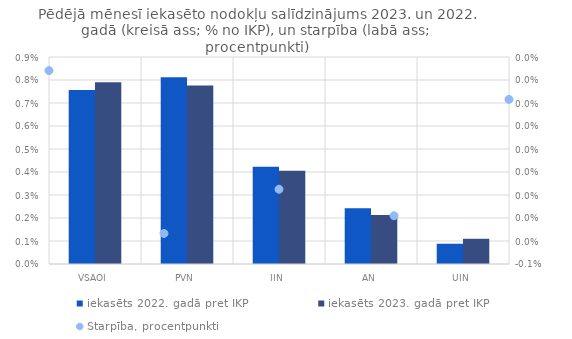
| Category | iekasēts 2022. gadā pret IKP | iekasēts 2023. gadā pret IKP |
|---|---|---|
| VSAOI | 0.008 | 0.008 |
| PVN | 0.008 | 0.008 |
| IIN | 0.004 | 0.004 |
| AN | 0.002 | 0.002 |
| UIN | 0.001 | 0.001 |